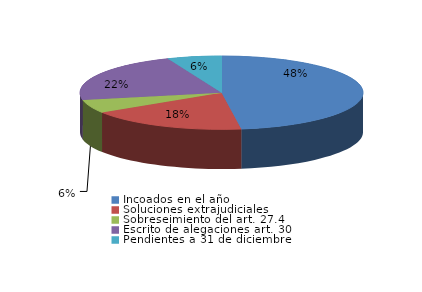
| Category | Series 0 |
|---|---|
| Incoados en el año | 247 |
| Soluciones extrajudiciales | 94 |
| Sobreseimiento del art. 27.4 | 30 |
| Escrito de alegaciones art. 30 | 114 |
| Pendientes a 31 de diciembre | 32 |